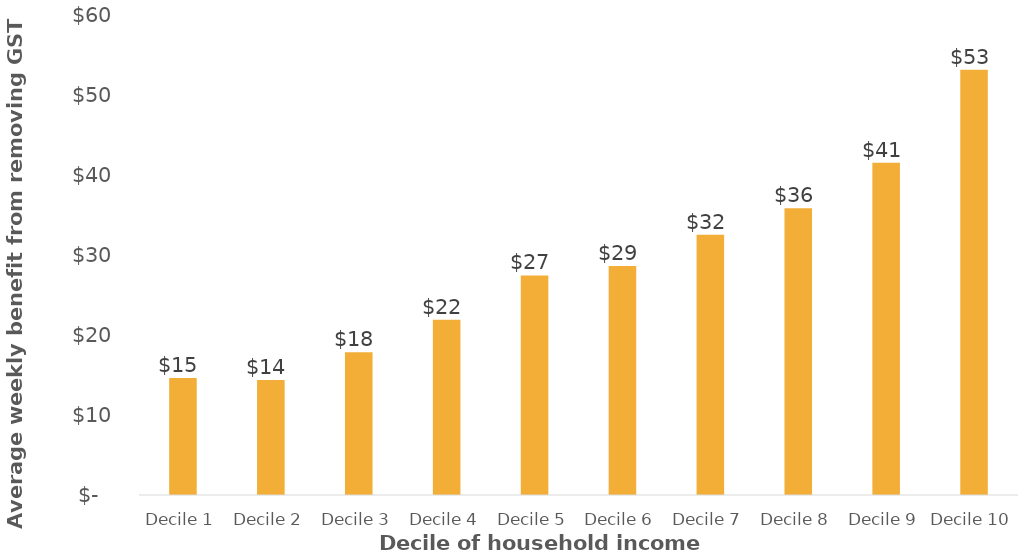
| Category | Series 0 |
|---|---|
| Decile 1 | 14.583 |
| Decile 2 | 14.348 |
| Decile 3 | 17.804 |
| Decile 4 | 21.874 |
| Decile 5 | 27.391 |
| Decile 6 | 28.578 |
| Decile 7 | 32.452 |
| Decile 8 | 35.778 |
| Decile 9 | 41.452 |
| Decile 10 | 53.035 |